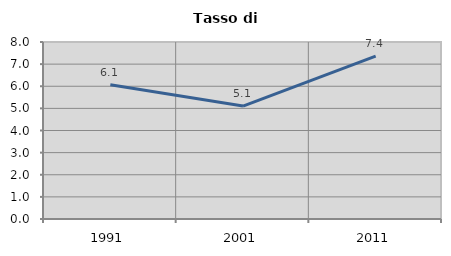
| Category | Tasso di disoccupazione   |
|---|---|
| 1991.0 | 6.068 |
| 2001.0 | 5.104 |
| 2011.0 | 7.365 |